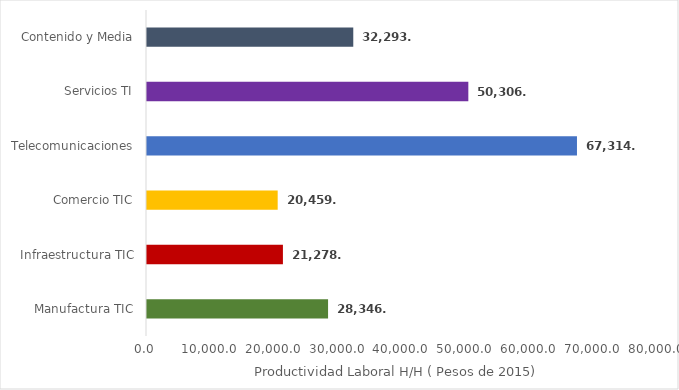
| Category | 2015 |
|---|---|
| Manufactura TIC | 28346.89 |
| Infraestructura TIC | 21278.942 |
| Comercio TIC | 20459.582 |
| Telecomunicaciones | 67314.767 |
| Servicios TI | 50306.615 |
| Contenido y Media | 32293.654 |